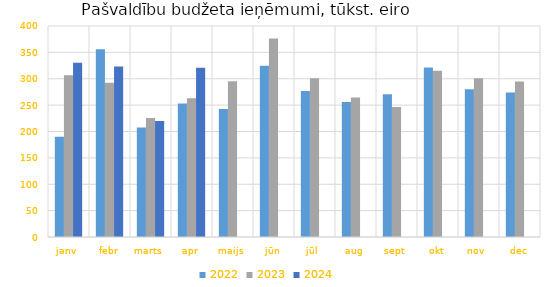
| Category | 2022 | 2023 | 2024 |
|---|---|---|---|
| janv | 190252.346 | 306465.267 | 330116.003 |
| febr | 356152.105 | 292294.044 | 323221.287 |
| marts | 207474.213 | 225671.949 | 219856.022 |
| apr | 253268.686 | 262816.149 | 320943.462 |
| maijs | 242842.454 | 295042.686 | 0 |
| jūn | 324518.39 | 376093.33 | 0 |
| jūl | 276611.728 | 301143.927 | 0 |
| aug | 255749.732 | 264350.383 | 0 |
| sept | 270436.895 | 246209.854 | 0 |
| okt | 321133.295 | 315285.341 | 0 |
| nov | 280117.67 | 300948.206 | 0 |
| dec | 273764.648 | 294625.015 | 0 |